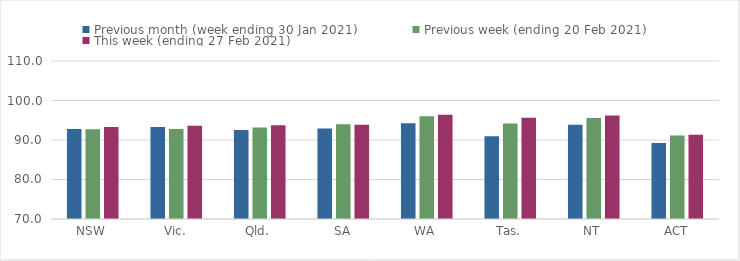
| Category | Previous month (week ending 30 Jan 2021) | Previous week (ending 20 Feb 2021) | This week (ending 27 Feb 2021) |
|---|---|---|---|
| NSW | 92.8 | 92.74 | 93.27 |
| Vic. | 93.28 | 92.8 | 93.63 |
| Qld. | 92.54 | 93.15 | 93.73 |
| SA | 92.94 | 93.98 | 93.84 |
| WA | 94.21 | 96 | 96.37 |
| Tas. | 90.96 | 94.19 | 95.66 |
| NT | 93.86 | 95.58 | 96.22 |
| ACT | 89.24 | 91.16 | 91.33 |